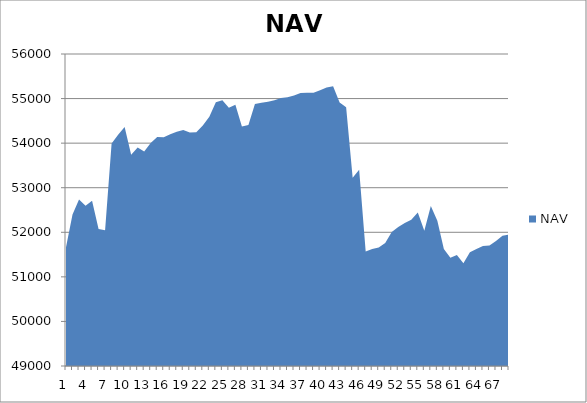
| Category | NAV |
|---|---|
| 0 | 51667 |
| 1 | 52397 |
| 2 | 52733.957 |
| 3 | 52597.875 |
| 4 | 52708.772 |
| 5 | 52075.184 |
| 6 | 52046.775 |
| 7 | 53991.219 |
| 8 | 54189.909 |
| 9 | 54364.909 |
| 10 | 53739.909 |
| 11 | 53899.542 |
| 12 | 53812.294 |
| 13 | 54003.961 |
| 14 | 54140.037 |
| 15 | 54132.37 |
| 16 | 54197.37 |
| 17 | 54255.812 |
| 18 | 54292.622 |
| 19 | 54240.699 |
| 20 | 54246.834 |
| 21 | 54397.391 |
| 22 | 54592.197 |
| 23 | 54920.119 |
| 24 | 54963.245 |
| 25 | 54796.799 |
| 26 | 54863.963 |
| 27 | 54375.975 |
| 28 | 54409.015 |
| 29 | 54878.402 |
| 30 | 54905.151 |
| 31 | 54927.958 |
| 32 | 54964.157 |
| 33 | 55012.385 |
| 34 | 55031.616 |
| 35 | 55070.791 |
| 36 | 55126.461 |
| 37 | 55131.71 |
| 38 | 55133.391 |
| 39 | 55184.783 |
| 40 | 55249.119 |
| 41 | 55278.196 |
| 42 | 54909.993 |
| 43 | 54807.052 |
| 44 | 53224.092 |
| 45 | 53401.214 |
| 46 | 51567.133 |
| 47 | 51627.536 |
| 48 | 51656.382 |
| 49 | 51762.295 |
| 50 | 52007.329 |
| 51 | 52120.149 |
| 52 | 52206.26 |
| 53 | 52279.944 |
| 54 | 52443.406 |
| 55 | 52034.315 |
| 56 | 52592.093 |
| 57 | 52259.795 |
| 58 | 51622.988 |
| 59 | 51427.586 |
| 60 | 51492.401 |
| 61 | 51307.336 |
| 62 | 51550.9 |
| 63 | 51625.058 |
| 64 | 51693.986 |
| 65 | 51704.014 |
| 66 | 51802.294 |
| 67 | 51922.294 |
| 68 | 51950.294 |